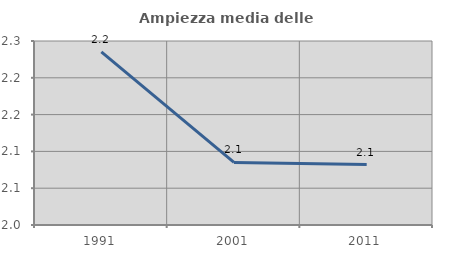
| Category | Ampiezza media delle famiglie |
|---|---|
| 1991.0 | 2.235 |
| 2001.0 | 2.085 |
| 2011.0 | 2.082 |